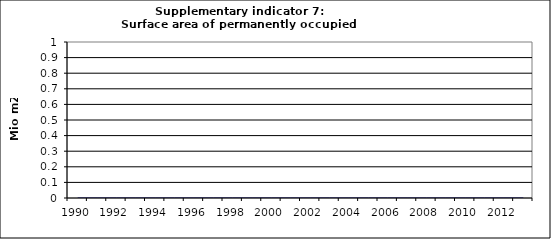
| Category | Surface area of permanently occupied dwellings, Mio m2  |
|---|---|
| 1990 | 0 |
| 1991 | 0 |
| 1992 | 0 |
| 1993 | 0 |
| 1994 | 0 |
| 1995 | 0 |
| 1996 | 0 |
| 1997 | 0 |
| 1998 | 0 |
| 1999 | 0 |
| 2000 | 0 |
| 2001 | 0 |
| 2002 | 0 |
| 2003 | 0 |
| 2004 | 0 |
| 2005 | 0 |
| 2006 | 0 |
| 2007 | 0 |
| 2008 | 0 |
| 2009 | 0 |
| 2010 | 0 |
| 2011 | 0 |
| 2012 | 0 |
| 2013 | 0 |